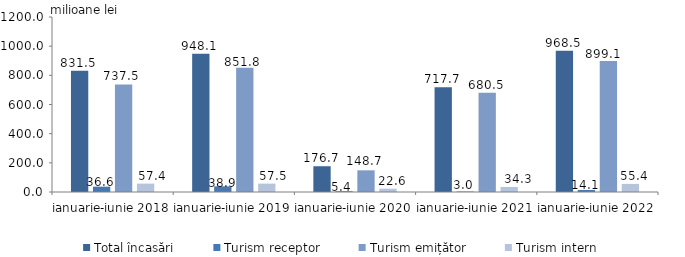
| Category | Total încasări | Turism receptor | Turism emițător | Turism intern |
|---|---|---|---|---|
| ianuarie-iunie 2018 | 831.5 | 36.6 | 737.5 | 57.4 |
| ianuarie-iunie 2019 | 948.1 | 38.9 | 851.8 | 57.5 |
| ianuarie-iunie 2020 | 176.7 | 5.4 | 148.7 | 22.6 |
| ianuarie-iunie 2021 | 717.7 | 3 | 680.5 | 34.3 |
| ianuarie-iunie 2022 | 968.5 | 14.1 | 899.1 | 55.4 |